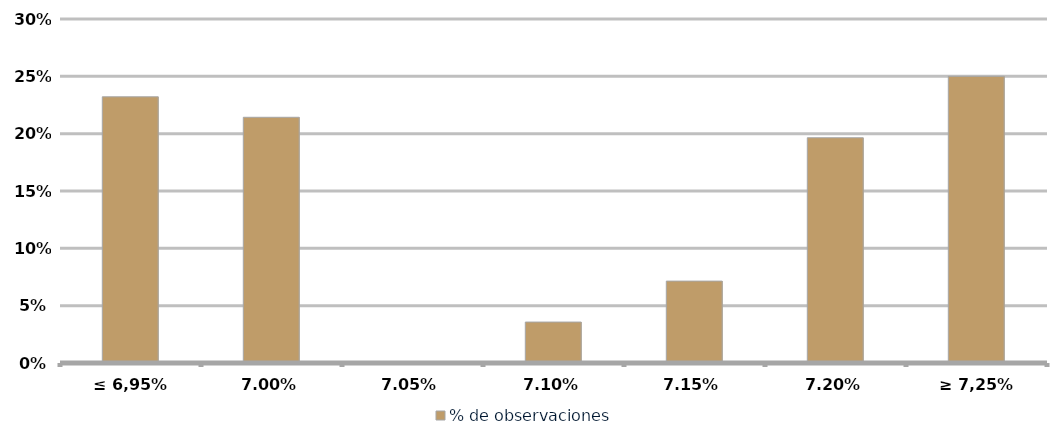
| Category | % de observaciones  |
|---|---|
| ≤ 6,95% | 0.232 |
| 7,00% | 0.214 |
| 7,05% | 0 |
| 7,10% | 0.036 |
| 7,15% | 0.071 |
| 7,20% | 0.196 |
| ≥ 7,25% | 0.25 |